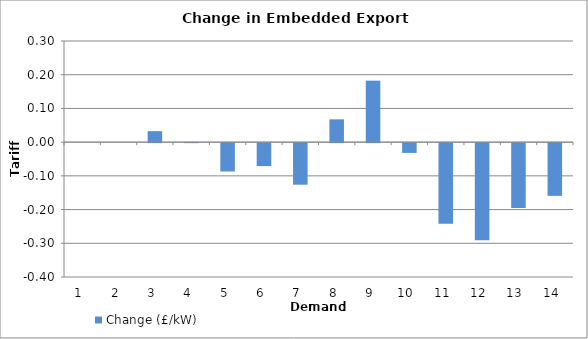
| Category | Change (£/kW) |
|---|---|
| 1.0 | 0 |
| 2.0 | 0 |
| 3.0 | 0.033 |
| 4.0 | 0.001 |
| 5.0 | -0.084 |
| 6.0 | -0.068 |
| 7.0 | -0.123 |
| 8.0 | 0.068 |
| 9.0 | 0.182 |
| 10.0 | -0.029 |
| 11.0 | -0.239 |
| 12.0 | -0.288 |
| 13.0 | -0.192 |
| 14.0 | -0.156 |